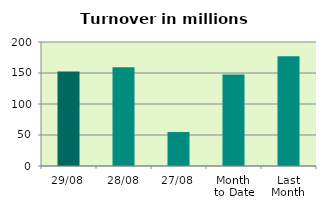
| Category | Series 0 |
|---|---|
| 29/08 | 152.362 |
| 28/08 | 159.145 |
| 27/08 | 54.792 |
| Month 
to Date | 147.775 |
| Last
Month | 177.022 |